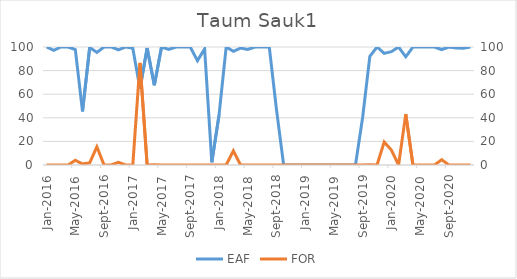
| Category | EAF |
|---|---|
| 2016-01-01 | 100 |
| 2016-02-01 | 97.13 |
| 2016-03-01 | 100 |
| 2016-04-01 | 100 |
| 2016-05-01 | 97.85 |
| 2016-06-01 | 45.39 |
| 2016-07-01 | 99.6 |
| 2016-08-01 | 95.43 |
| 2016-09-01 | 100 |
| 2016-10-01 | 99.99 |
| 2016-11-01 | 97.6 |
| 2016-12-01 | 100 |
| 2017-01-01 | 98.99 |
| 2017-02-01 | 64.69 |
| 2017-03-01 | 99.06 |
| 2017-04-01 | 67.62 |
| 2017-05-01 | 100 |
| 2017-06-01 | 97.99 |
| 2017-07-01 | 100 |
| 2017-08-01 | 100 |
| 2017-09-01 | 100 |
| 2017-10-01 | 88.44 |
| 2017-11-01 | 98.43 |
| 2017-12-01 | 2.29 |
| 2018-01-01 | 42.07 |
| 2018-02-01 | 100 |
| 2018-03-01 | 96.29 |
| 2018-04-01 | 99.03 |
| 2018-05-01 | 97.96 |
| 2018-06-01 | 100 |
| 2018-07-01 | 99.97 |
| 2018-08-01 | 100 |
| 2018-09-01 | 47.15 |
| 2018-10-01 | 0 |
| 2018-11-01 | 0 |
| 2018-12-01 | 0 |
| 2019-01-01 | 0 |
| 2019-02-01 | 0 |
| 2019-03-01 | 0 |
| 2019-04-01 | 0 |
| 2019-05-01 | 0 |
| 2019-06-01 | 0 |
| 2019-07-01 | 0 |
| 2019-08-01 | 0 |
| 2019-09-01 | 40.47 |
| 2019-10-01 | 92.14 |
| 2019-11-01 | 100 |
| 2019-12-01 | 94.57 |
| 2020-01-01 | 96.07 |
| 2020-02-01 | 100 |
| 2020-03-01 | 91.7 |
| 2020-04-01 | 100 |
| 2020-05-01 | 99.99 |
| 2020-06-01 | 100 |
| 2020-07-01 | 100 |
| 2020-08-01 | 97.85 |
| 2020-09-01 | 99.99 |
| 2020-10-01 | 99.19 |
| 2020-11-01 | 99.03 |
| 2020-12-01 | 100 |